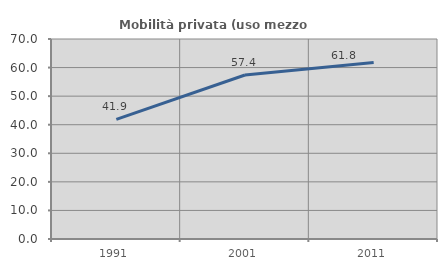
| Category | Mobilità privata (uso mezzo privato) |
|---|---|
| 1991.0 | 41.852 |
| 2001.0 | 57.407 |
| 2011.0 | 61.809 |